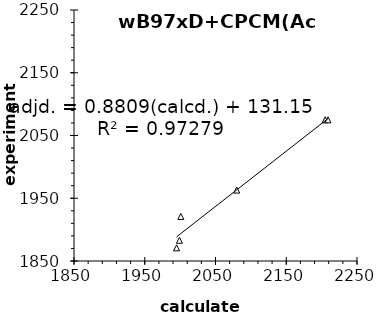
| Category | wB97xD |
|---|---|
| 1995.0 | 1871 |
| 1999.0 | 1883 |
| 2001.0 | 1921 |
| 2080.0 | 1963 |
| 2205.0 | 2075 |
| 2209.0 | 2075 |